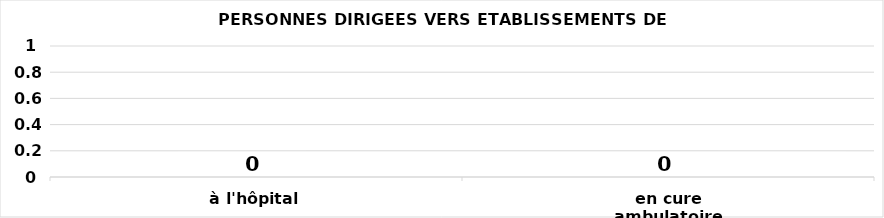
| Category | Series 0 |
|---|---|
| à l'hôpital | 0 |
| en cure ambulatoire | 0 |